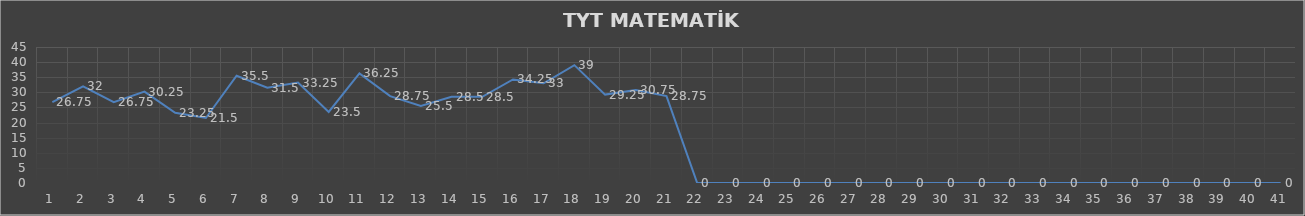
| Category | Series 0 |
|---|---|
| 0 | 26.75 |
| 1 | 32 |
| 2 | 26.75 |
| 3 | 30.25 |
| 4 | 23.25 |
| 5 | 21.5 |
| 6 | 35.5 |
| 7 | 31.5 |
| 8 | 33.25 |
| 9 | 23.5 |
| 10 | 36.25 |
| 11 | 28.75 |
| 12 | 25.5 |
| 13 | 28.5 |
| 14 | 28.5 |
| 15 | 34.25 |
| 16 | 33 |
| 17 | 39 |
| 18 | 29.25 |
| 19 | 30.75 |
| 20 | 28.75 |
| 21 | 0 |
| 22 | 0 |
| 23 | 0 |
| 24 | 0 |
| 25 | 0 |
| 26 | 0 |
| 27 | 0 |
| 28 | 0 |
| 29 | 0 |
| 30 | 0 |
| 31 | 0 |
| 32 | 0 |
| 33 | 0 |
| 34 | 0 |
| 35 | 0 |
| 36 | 0 |
| 37 | 0 |
| 38 | 0 |
| 39 | 0 |
| 40 | 0 |